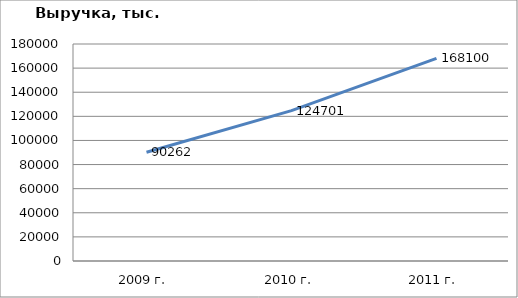
| Category | Series 0 |
|---|---|
| 2009 г. | 90262 |
| 2010 г. | 124701 |
| 2011 г. | 168100 |